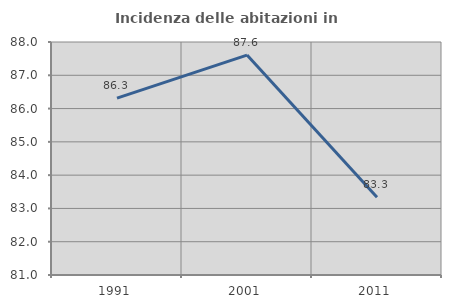
| Category | Incidenza delle abitazioni in proprietà  |
|---|---|
| 1991.0 | 86.316 |
| 2001.0 | 87.606 |
| 2011.0 | 83.333 |